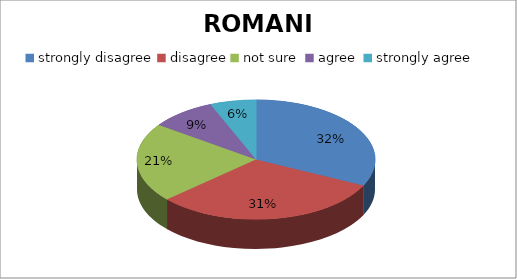
| Category | ROMANIA |
|---|---|
| strongly disagree | 36 |
| disagree | 35 |
| not sure  | 24 |
| agree  | 10 |
| strongly agree | 7 |